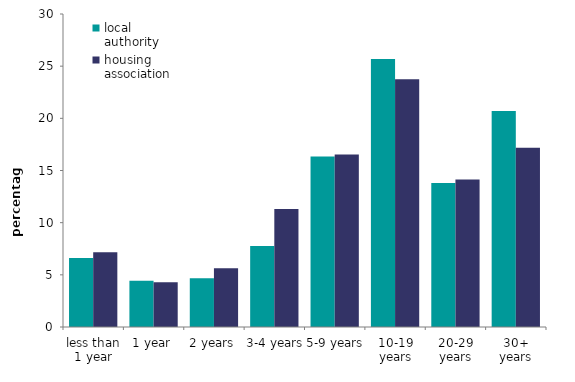
| Category | local authority | housing association |
|---|---|---|
| less than 1 year | 6.614 | 7.156 |
| 1 year | 4.424 | 4.3 |
| 2 years | 4.682 | 5.629 |
| 3-4 years | 7.754 | 11.316 |
| 5-9 years | 16.339 | 16.54 |
| 10-19 years | 25.69 | 23.743 |
| 20-29 years | 13.794 | 14.138 |
| 30+ years | 20.703 | 17.178 |